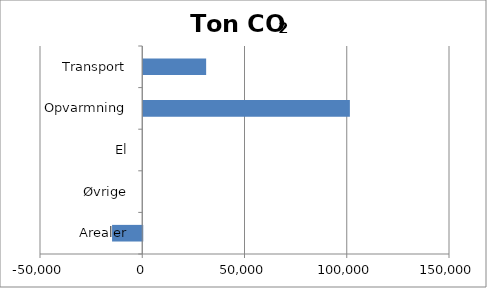
| Category | Series 0 |
|---|---|
| Arealer | -14760.261 |
| Øvrige | 0 |
| El | 0 |
| Opvarmning | 101040.491 |
| Transport | 30757.057 |